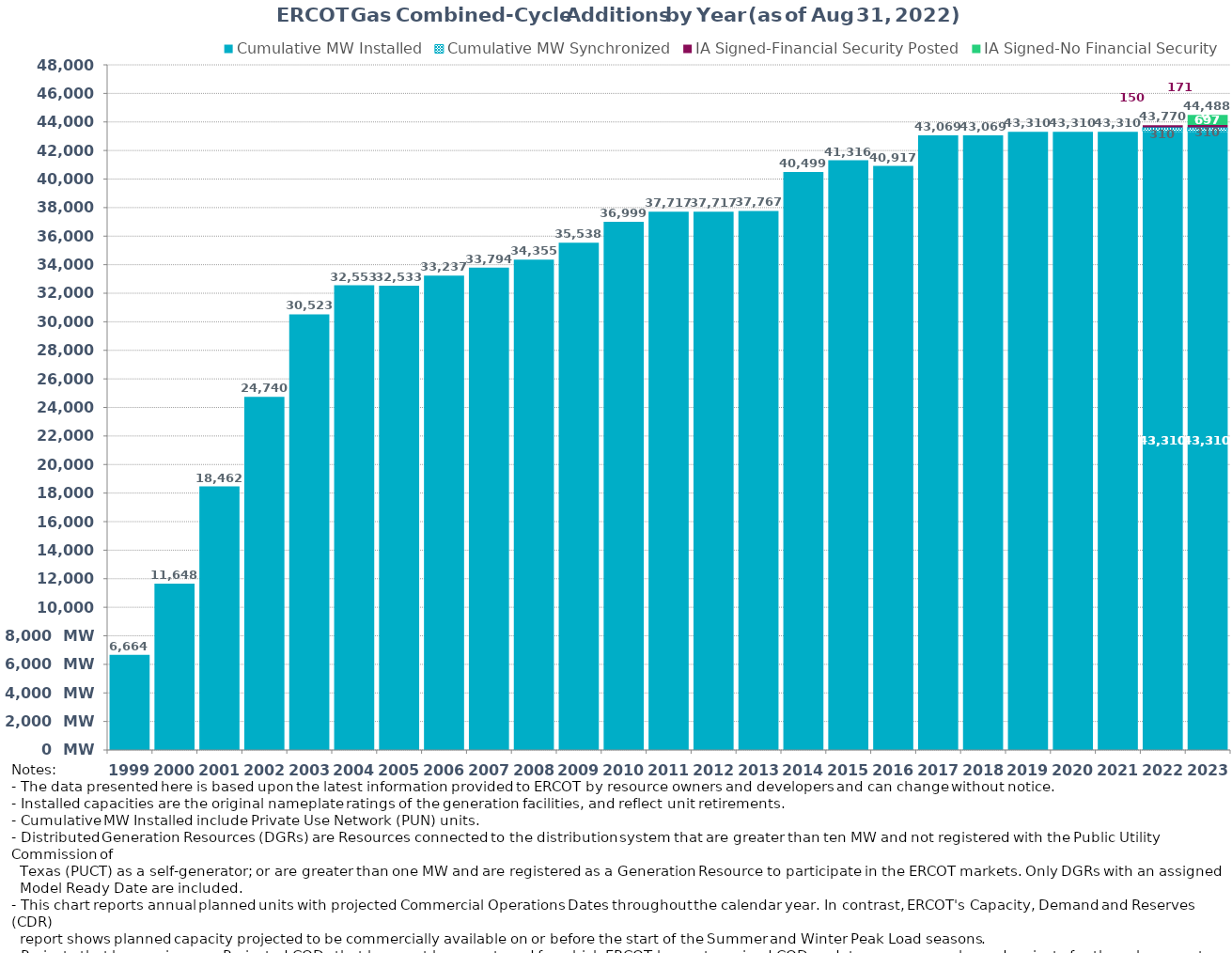
| Category | Cumulative MW Installed | Cumulative MW Synchronized | IA Signed-Financial Security Posted  | IA Signed-No Financial Security  | Other Planned | Cumulative Installed and Planned |
|---|---|---|---|---|---|---|
| 1999.0 | 6664.109 | 0 | 0 | 0 | 0 | 6664.109 |
| 2000.0 | 11648.109 | 0 | 0 | 0 | 0 | 11648.109 |
| 2001.0 | 18462.109 | 0 | 0 | 0 | 0 | 18462.109 |
| 2002.0 | 24739.509 | 0 | 0 | 0 | 0 | 24739.509 |
| 2003.0 | 30523.359 | 0 | 0 | 0 | 0 | 30523.359 |
| 2004.0 | 32553.479 | 0 | 0 | 0 | 0 | 32553.479 |
| 2005.0 | 32532.579 | 0 | 0 | 0 | 0 | 32532.579 |
| 2006.0 | 33237.379 | 0 | 0 | 0 | 0 | 33237.379 |
| 2007.0 | 33794.379 | 0 | 0 | 0 | 0 | 33794.379 |
| 2008.0 | 34355.379 | 0 | 0 | 0 | 0 | 34355.379 |
| 2009.0 | 35538.379 | 0 | 0 | 0 | 0 | 35538.379 |
| 2010.0 | 36999.379 | 0 | 0 | 0 | 0 | 36999.379 |
| 2011.0 | 37717.379 | 0 | 0 | 0 | 0 | 37717.379 |
| 2012.0 | 37717.379 | 0 | 0 | 0 | 0 | 37717.379 |
| 2013.0 | 37767.379 | 0 | 0 | 0 | 0 | 37767.379 |
| 2014.0 | 40499.379 | 0 | 0 | 0 | 0 | 40499.379 |
| 2015.0 | 41316.379 | 0 | 0 | 0 | 0 | 41316.379 |
| 2016.0 | 40917.379 | 0 | 0 | 0 | 0 | 40917.379 |
| 2017.0 | 43069.379 | 0 | 0 | 0 | 0 | 43069.379 |
| 2018.0 | 43069.379 | 0 | 0 | 0 | 0 | 43069.379 |
| 2019.0 | 43309.779 | 0 | 0 | 0 | 0 | 43309.779 |
| 2020.0 | 43309.779 | 0 | 0 | 0 | 0 | 43309.779 |
| 2021.0 | 43309.779 | 0 | 0 | 0 | 0 | 43309.779 |
| 2022.0 | 43309.779 | 310 | 150 | 0 | 0 | 43769.779 |
| 2023.0 | 43309.779 | 310 | 171 | 697 | 0 | 44487.779 |